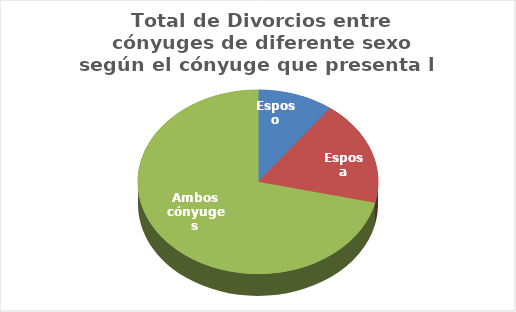
| Category | Series 0 |
|---|---|
| Esposo | 7790 |
| Esposa | 14035 |
| Ambos cónyuges | 54280 |